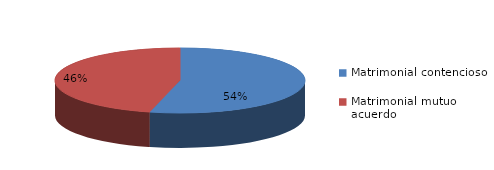
| Category | Series 0 |
|---|---|
| 0 | 1120 |
| 1 | 959 |